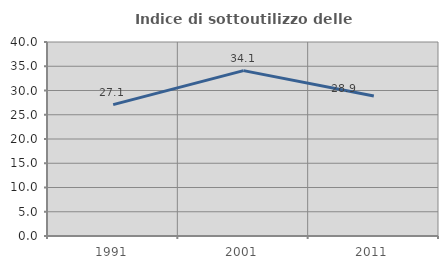
| Category | Indice di sottoutilizzo delle abitazioni  |
|---|---|
| 1991.0 | 27.09 |
| 2001.0 | 34.103 |
| 2011.0 | 28.881 |